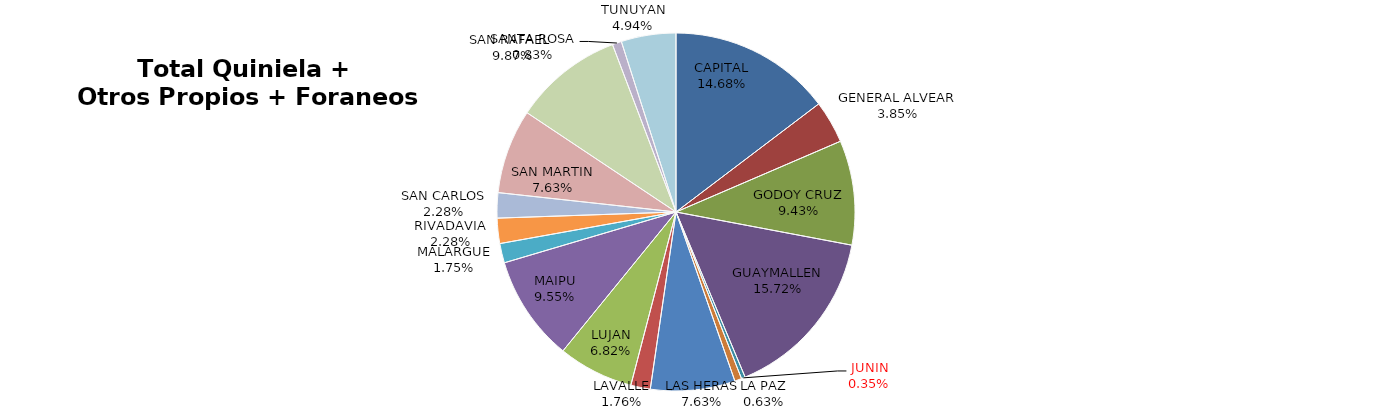
| Category | Total Quiniela + Otros Propios + Foraneos (Beneficio) |
|---|---|
| CAPITAL | 4005066.74 |
| GENERAL ALVEAR | 1050465.85 |
| GODOY CRUZ | 2573552 |
| GUAYMALLEN | 4287955.1 |
| JUNIN | -95196.54 |
| LA PAZ | 171442.51 |
| LAS HERAS | 2080980.53 |
| LAVALLE | 481234.01 |
| LUJAN | 1858953.04 |
| MAIPU | 2603707.92 |
| MALARGUE | 478436.35 |
| RIVADAVIA | 621746.37 |
| SAN CARLOS | 620740.4 |
| SAN MARTIN | 2080452.39 |
| SAN RAFAEL  | 2693387.53 |
| SANTA ROSA | 227086.17 |
| TUNUYAN | 1346903.12 |